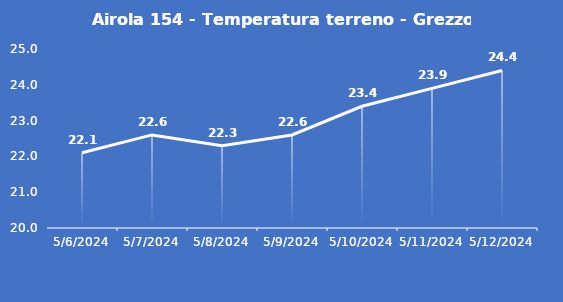
| Category | Airola 154 - Temperatura terreno - Grezzo (°C) |
|---|---|
| 5/6/24 | 22.1 |
| 5/7/24 | 22.6 |
| 5/8/24 | 22.3 |
| 5/9/24 | 22.6 |
| 5/10/24 | 23.4 |
| 5/11/24 | 23.9 |
| 5/12/24 | 24.4 |